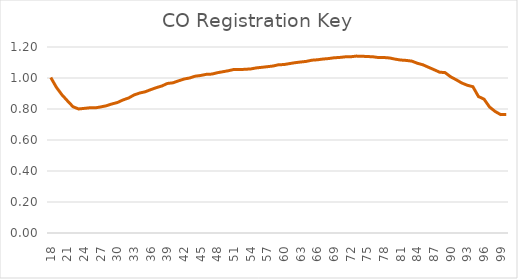
| Category | CO Registration Key - Empirical |
|---|---|
| 18.0 | 1.003 |
| 19.0 | 0.941 |
| 20.0 | 0.892 |
| 21.0 | 0.853 |
| 22.0 | 0.815 |
| 23.0 | 0.8 |
| 24.0 | 0.804 |
| 25.0 | 0.808 |
| 26.0 | 0.807 |
| 27.0 | 0.813 |
| 28.0 | 0.821 |
| 29.0 | 0.833 |
| 30.0 | 0.842 |
| 31.0 | 0.858 |
| 32.0 | 0.871 |
| 33.0 | 0.891 |
| 34.0 | 0.903 |
| 35.0 | 0.911 |
| 36.0 | 0.925 |
| 37.0 | 0.938 |
| 38.0 | 0.949 |
| 39.0 | 0.965 |
| 40.0 | 0.969 |
| 41.0 | 0.982 |
| 42.0 | 0.994 |
| 43.0 | 1 |
| 44.0 | 1.012 |
| 45.0 | 1.016 |
| 46.0 | 1.024 |
| 47.0 | 1.025 |
| 48.0 | 1.034 |
| 49.0 | 1.041 |
| 50.0 | 1.047 |
| 51.0 | 1.055 |
| 52.0 | 1.054 |
| 53.0 | 1.056 |
| 54.0 | 1.058 |
| 55.0 | 1.065 |
| 56.0 | 1.069 |
| 57.0 | 1.073 |
| 58.0 | 1.077 |
| 59.0 | 1.085 |
| 60.0 | 1.087 |
| 61.0 | 1.093 |
| 62.0 | 1.099 |
| 63.0 | 1.103 |
| 64.0 | 1.107 |
| 65.0 | 1.115 |
| 66.0 | 1.118 |
| 67.0 | 1.122 |
| 68.0 | 1.125 |
| 69.0 | 1.13 |
| 70.0 | 1.133 |
| 71.0 | 1.136 |
| 72.0 | 1.137 |
| 73.0 | 1.141 |
| 74.0 | 1.14 |
| 75.0 | 1.139 |
| 76.0 | 1.137 |
| 77.0 | 1.132 |
| 78.0 | 1.132 |
| 79.0 | 1.129 |
| 80.0 | 1.122 |
| 81.0 | 1.116 |
| 82.0 | 1.113 |
| 83.0 | 1.109 |
| 84.0 | 1.095 |
| 85.0 | 1.085 |
| 86.0 | 1.069 |
| 87.0 | 1.054 |
| 88.0 | 1.038 |
| 89.0 | 1.035 |
| 90.0 | 1.008 |
| 91.0 | 0.988 |
| 92.0 | 0.968 |
| 93.0 | 0.953 |
| 94.0 | 0.944 |
| 95.0 | 0.88 |
| 96.0 | 0.864 |
| 97.0 | 0.813 |
| 98.0 | 0.784 |
| 99.0 | 0.764 |
| 100.0 | 0.765 |